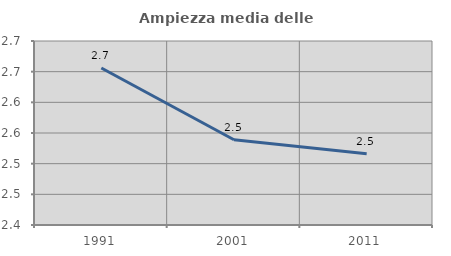
| Category | Ampiezza media delle famiglie |
|---|---|
| 1991.0 | 2.656 |
| 2001.0 | 2.539 |
| 2011.0 | 2.516 |